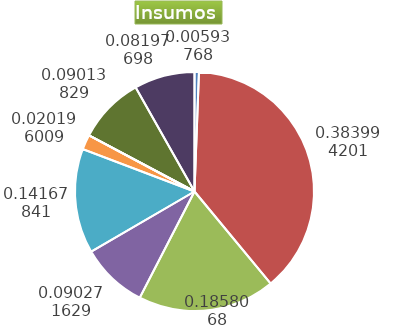
| Category | Series 0 |
|---|---|
| Control arvenses | 477769 |
| Control fitosanitario | 30897678 |
| Cosecha y beneficio | 14950743.167 |
| Fertilización | 7263609 |
| Instalación | 11400000 |
| Otros | 1625050 |
| Podas | 0 |
| Riego | 0 |
| Transporte | 7252880 |
| Tutorado | 6596189 |